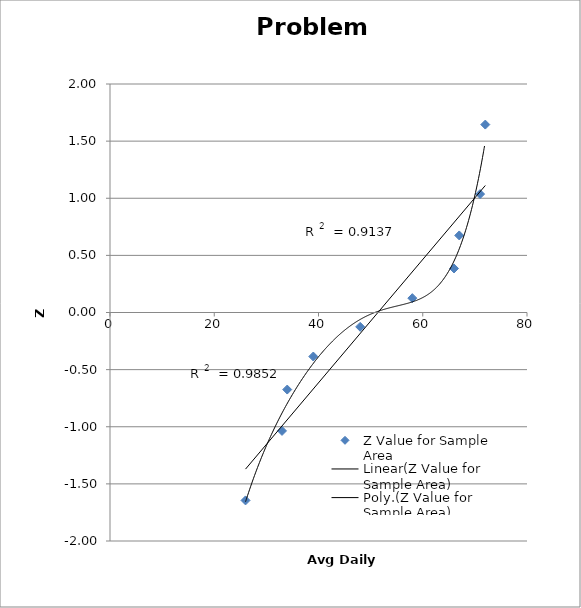
| Category | Z Value for Sample Area |
|---|---|
| 26.0 | -1.645 |
| 33.0 | -1.036 |
| 34.0 | -0.674 |
| 39.0 | -0.385 |
| 48.0 | -0.126 |
| 58.0 | 0.126 |
| 66.0 | 0.385 |
| 67.0 | 0.674 |
| 71.0 | 1.036 |
| 72.0 | 1.645 |